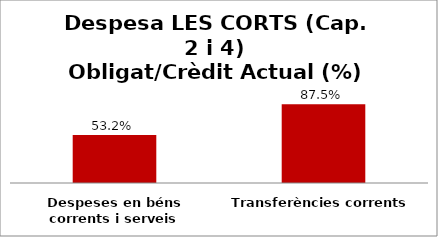
| Category | Series 0 |
|---|---|
| Despeses en béns corrents i serveis | 0.532 |
| Transferències corrents | 0.875 |